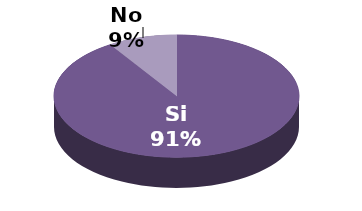
| Category | Series 1 |
|---|---|
| Si | 30 |
| No | 3 |